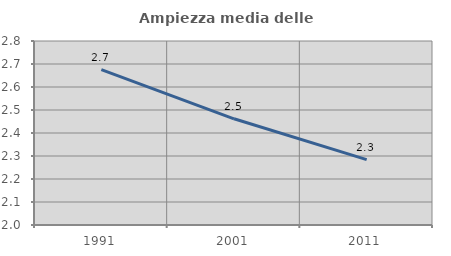
| Category | Ampiezza media delle famiglie |
|---|---|
| 1991.0 | 2.676 |
| 2001.0 | 2.462 |
| 2011.0 | 2.284 |